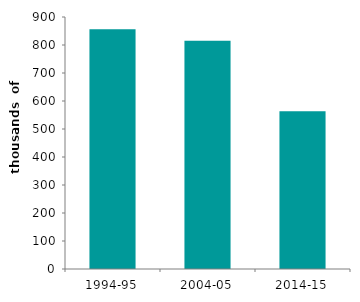
| Category | first time buyer |
|---|---|
| 1994-95 | 856.651 |
| 2004-05 | 814.888 |
| 2014-15 | 563.645 |